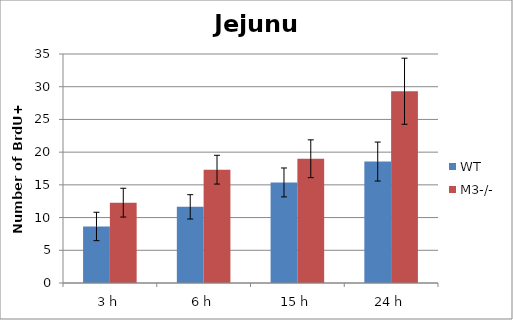
| Category | WT | M3-/- |
|---|---|---|
| 3 h | 8.64 | 12.28 |
| 6 h | 11.64 | 17.32 |
| 15 h | 15.37 | 18.99 |
| 24 h | 18.56 | 29.31 |